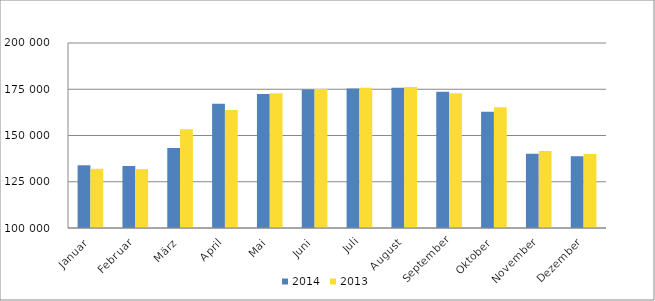
| Category | 2014 | 2013 |
|---|---|---|
| Januar | 133898 | 131991 |
| Februar | 133529 | 131825 |
| März | 143294 | 153347 |
| April | 167208 | 163785 |
| Mai | 172494 | 172791 |
| Juni | 174799 | 175081 |
| Juli | 175426 | 175765 |
| August | 175825 | 176223 |
| September | 173684 | 172821 |
| Oktober | 162798 | 165302 |
| November | 140172 | 141630 |
| Dezember | 138827 | 140040 |